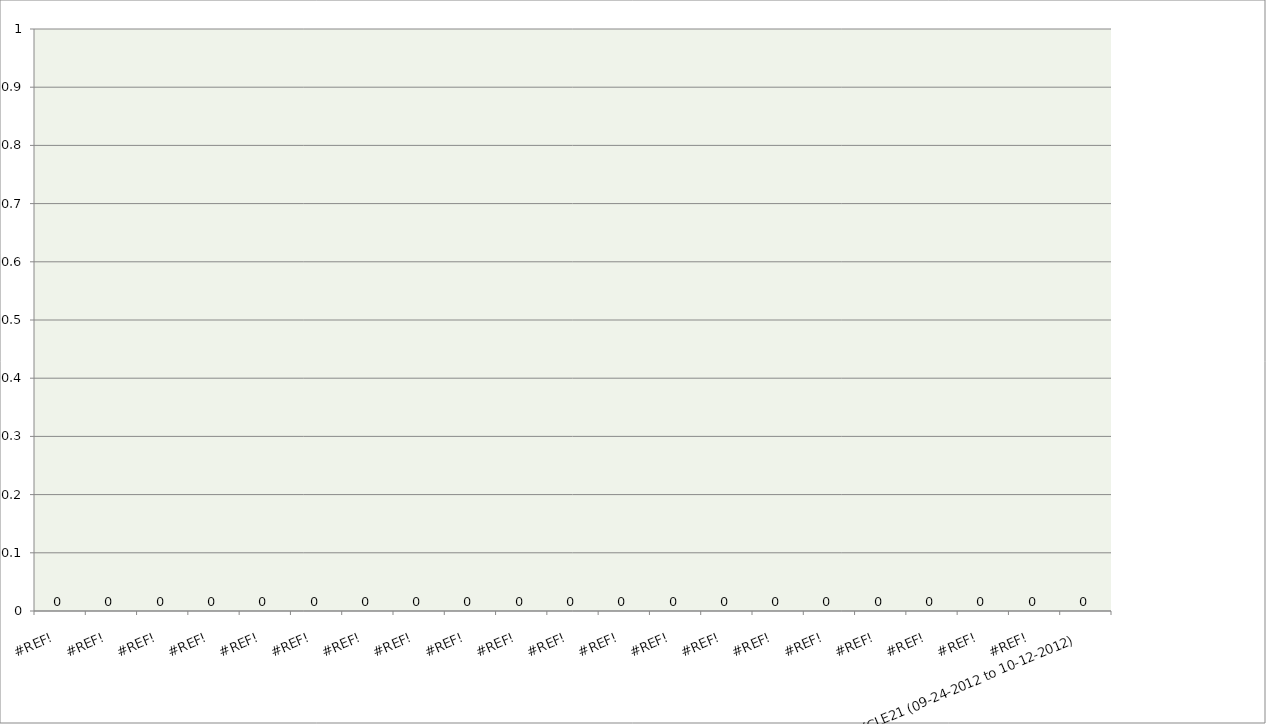
| Category | Series 0 |
|---|---|
| #REF! | 0 |
| #REF! | 0 |
| #REF! | 0 |
| #REF! | 0 |
| #REF! | 0 |
| #REF! | 0 |
| #REF! | 0 |
| #REF! | 0 |
| #REF! | 0 |
| #REF! | 0 |
| #REF! | 0 |
| #REF! | 0 |
| #REF! | 0 |
| #REF! | 0 |
| #REF! | 0 |
| #REF! | 0 |
| #REF! | 0 |
| #REF! | 0 |
| #REF! | 0 |
| #REF! | 0 |
| CYCLE21 (09-24-2012 to 10-12-2012) | 0 |